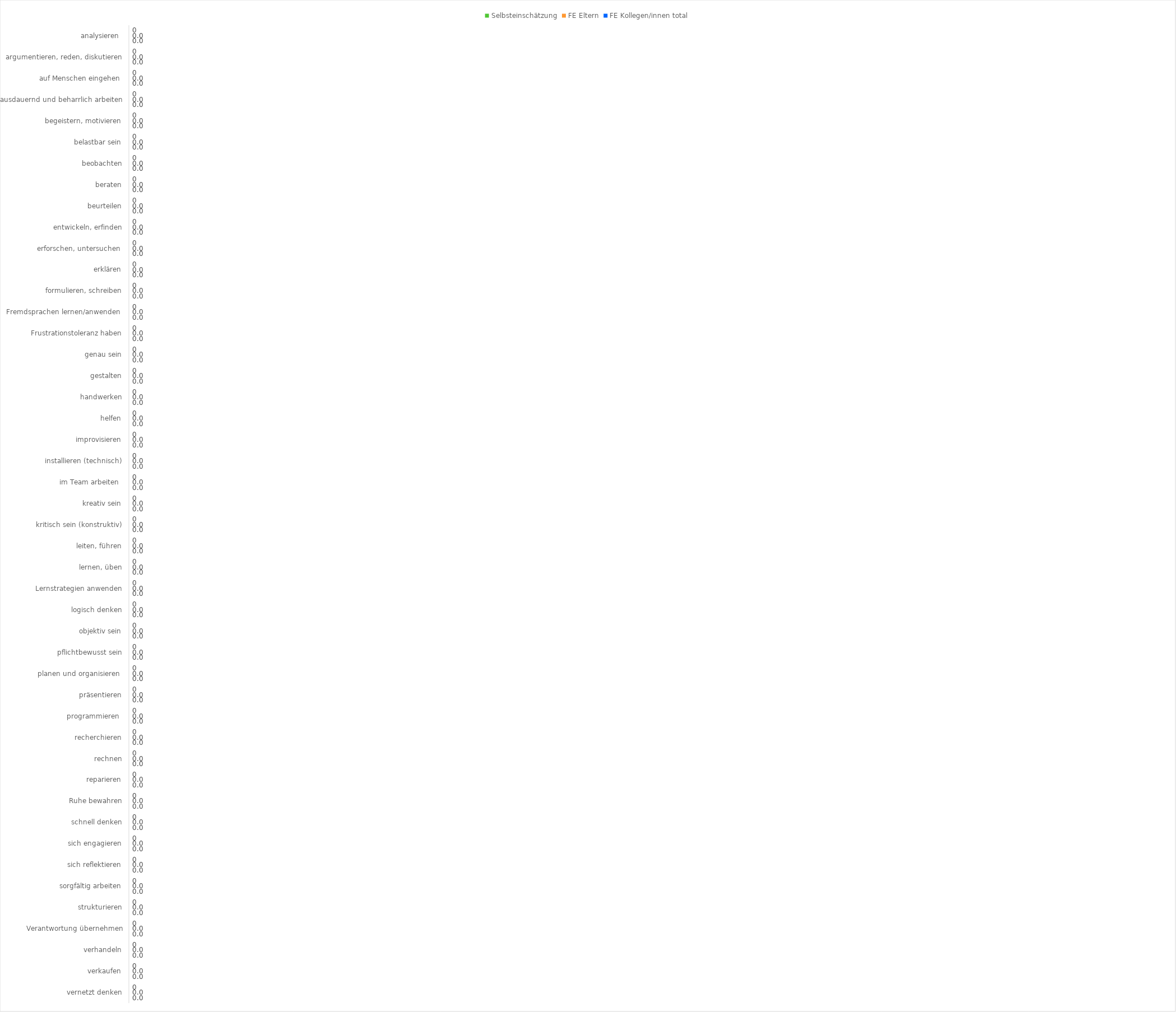
| Category | Selbsteinschätzung | FE Eltern | FE Kollegen/innen total |
|---|---|---|---|
| analysieren  | 0 | 0 | 0 |
| argumentieren, reden, diskutieren | 0 | 0 | 0 |
| auf Menschen eingehen  | 0 | 0 | 0 |
| ausdauernd und beharrlich arbeiten | 0 | 0 | 0 |
| begeistern, motivieren | 0 | 0 | 0 |
| belastbar sein | 0 | 0 | 0 |
| beobachten | 0 | 0 | 0 |
| beraten | 0 | 0 | 0 |
| beurteilen | 0 | 0 | 0 |
| entwickeln, erfinden | 0 | 0 | 0 |
| erforschen, untersuchen  | 0 | 0 | 0 |
| erklären | 0 | 0 | 0 |
| formulieren, schreiben | 0 | 0 | 0 |
| Fremdsprachen lernen/anwenden  | 0 | 0 | 0 |
| Frustrationstoleranz haben | 0 | 0 | 0 |
| genau sein | 0 | 0 | 0 |
| gestalten | 0 | 0 | 0 |
| handwerken | 0 | 0 | 0 |
| helfen | 0 | 0 | 0 |
| improvisieren | 0 | 0 | 0 |
| installieren (technisch) | 0 | 0 | 0 |
| im Team arbeiten  | 0 | 0 | 0 |
| kreativ sein | 0 | 0 | 0 |
| kritisch sein (konstruktiv) | 0 | 0 | 0 |
| leiten, führen | 0 | 0 | 0 |
| lernen, üben | 0 | 0 | 0 |
| Lernstrategien anwenden | 0 | 0 | 0 |
| logisch denken | 0 | 0 | 0 |
| objektiv sein | 0 | 0 | 0 |
| pflichtbewusst sein | 0 | 0 | 0 |
| planen und organisieren  | 0 | 0 | 0 |
| präsentieren | 0 | 0 | 0 |
| programmieren  | 0 | 0 | 0 |
| recherchieren | 0 | 0 | 0 |
| rechnen | 0 | 0 | 0 |
| reparieren | 0 | 0 | 0 |
| Ruhe bewahren | 0 | 0 | 0 |
| schnell denken | 0 | 0 | 0 |
| sich engagieren | 0 | 0 | 0 |
| sich reflektieren | 0 | 0 | 0 |
| sorgfältig arbeiten | 0 | 0 | 0 |
| strukturieren | 0 | 0 | 0 |
| Verantwortung übernehmen | 0 | 0 | 0 |
| verhandeln | 0 | 0 | 0 |
| verkaufen | 0 | 0 | 0 |
| vernetzt denken | 0 | 0 | 0 |